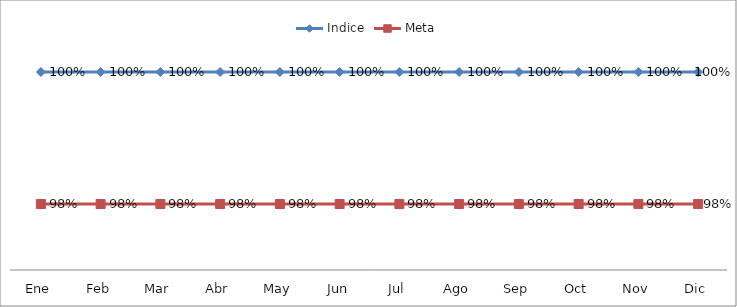
| Category | Indice | Meta |
|---|---|---|
| Ene | 1 | 0.98 |
| Feb | 1 | 0.98 |
| Mar | 1 | 0.98 |
| Abr | 1 | 0.98 |
| May | 1 | 0.98 |
| Jun | 1 | 0.98 |
| Jul | 1 | 0.98 |
| Ago | 1 | 0.98 |
| Sep | 1 | 0.98 |
| Oct | 1 | 0.98 |
| Nov | 1 | 0.98 |
| Dic | 1 | 0.98 |